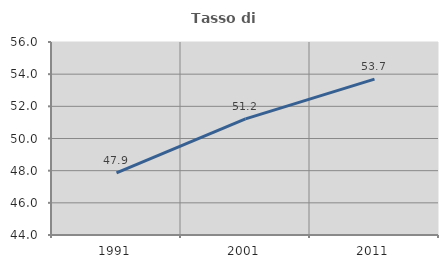
| Category | Tasso di occupazione   |
|---|---|
| 1991.0 | 47.863 |
| 2001.0 | 51.219 |
| 2011.0 | 53.692 |